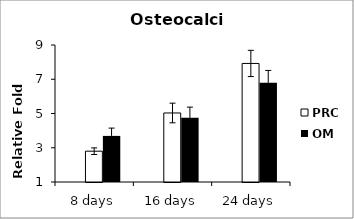
| Category | FBS | PRC | OM |
|---|---|---|---|
| 8 days | 1 | 2.799 | 3.692 |
| 16 days | 1 | 5.03 | 4.756 |
| 24 days | 1 | 7.923 | 6.802 |